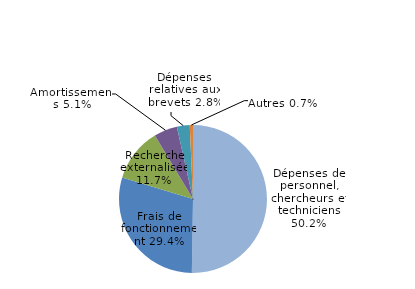
| Category | Series 0 |
|---|---|
| Dépenses de personnel, chercheurs et techniciens | 0.502 |
| Frais de fonctionnement | 0.294 |
| Recherche externalisée | 0.117 |
| Amortissements | 0.051 |
| Dépenses relatives aux brevets | 0.028 |
| Autres | 0.007 |